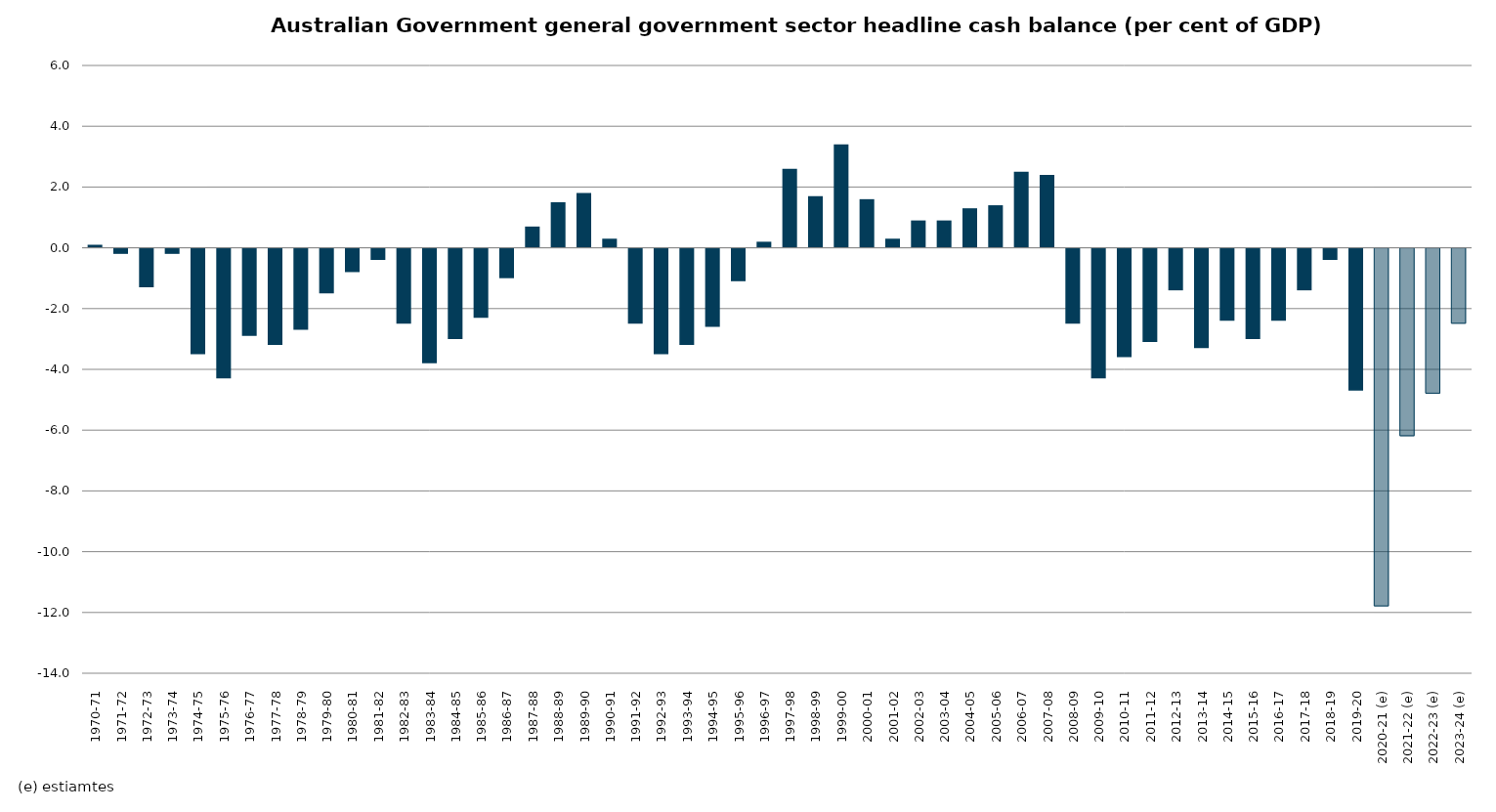
| Category | Headline cash balance |
|---|---|
| 1970-71 | 0.1 |
| 1971-72 | -0.2 |
| 1972-73 | -1.3 |
| 1973-74 | -0.2 |
| 1974-75 | -3.5 |
| 1975-76 | -4.3 |
| 1976-77 | -2.9 |
| 1977-78 | -3.2 |
| 1978-79 | -2.7 |
| 1979-80 | -1.5 |
| 1980-81 | -0.8 |
| 1981-82 | -0.4 |
| 1982-83 | -2.5 |
| 1983-84 | -3.8 |
| 1984-85 | -3 |
| 1985-86 | -2.3 |
| 1986-87 | -1 |
| 1987-88 | 0.7 |
| 1988-89 | 1.5 |
| 1989-90 | 1.8 |
| 1990-91 | 0.3 |
| 1991-92 | -2.5 |
| 1992-93 | -3.5 |
| 1993-94 | -3.2 |
| 1994-95 | -2.6 |
| 1995-96 | -1.1 |
| 1996-97 | 0.2 |
| 1997-98 | 2.6 |
| 1998-99 | 1.7 |
| 1999-00 | 3.4 |
| 2000-01 | 1.6 |
| 2001-02 | 0.3 |
| 2002-03 | 0.9 |
| 2003-04 | 0.9 |
| 2004-05 | 1.3 |
| 2005-06 | 1.4 |
| 2006-07 | 2.5 |
| 2007-08 | 2.4 |
| 2008-09 | -2.5 |
| 2009-10 | -4.3 |
| 2010-11 | -3.6 |
| 2011-12 | -3.1 |
| 2012-13 | -1.4 |
| 2013-14 | -3.3 |
| 2014-15 | -2.4 |
| 2015-16 | -3 |
| 2016-17 | -2.4 |
| 2017-18 | -1.4 |
| 2018-19 | -0.4 |
| 2019-20 | -4.7 |
| 2020-21 (e) | -11.8 |
| 2021-22 (e) | -6.2 |
| 2022-23 (e) | -4.8 |
| 2023-24 (e) | -2.5 |